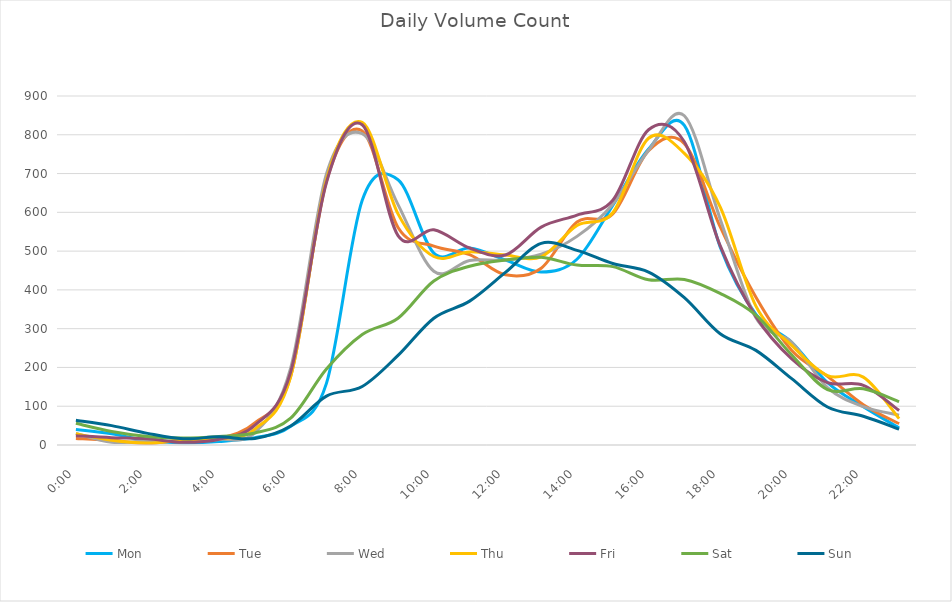
| Category | Mon | Tue | Wed | Thu | Fri | Sat | Sun |
|---|---|---|---|---|---|---|---|
| 0.0 | 40 | 17 | 30 | 29 | 24 | 56 | 64 |
| 0.0416666666666667 | 29 | 12 | 7 | 12 | 19 | 35 | 50 |
| 0.0833333333333333 | 11 | 4 | 11 | 5 | 16 | 22 | 30 |
| 0.125 | 6 | 14 | 8 | 13 | 7 | 18 | 16 |
| 0.166666666666667 | 9 | 17 | 14 | 16 | 15 | 22 | 21 |
| 0.208333333333333 | 19 | 57 | 32 | 41 | 51 | 31 | 17 |
| 0.25 | 48 | 177 | 198 | 176 | 188 | 69 | 49 |
| 0.291666666666667 | 159 | 680 | 699 | 684 | 677 | 196 | 126 |
| 0.333333333333333 | 631 | 810 | 803 | 832 | 826 | 285 | 151 |
| 0.375 | 684 | 561 | 620 | 596 | 540 | 327 | 231 |
| 0.416666666666667 | 495 | 513 | 448 | 486 | 555 | 423 | 327 |
| 0.4583333333333333 | 508 | 491 | 476 | 498 | 508 | 461 | 371 |
| 0.5 | 477 | 439 | 477 | 490 | 490 | 477 | 445 |
| 0.541666666666667 | 446 | 456 | 492 | 485 | 562 | 484 | 520 |
| 0.5833333333333334 | 479 | 575 | 538 | 566 | 593 | 464 | 502 |
| 0.625 | 618 | 596 | 621 | 599 | 631 | 460 | 468 |
| 0.666666666666667 | 763 | 759 | 760 | 791 | 813 | 426 | 446 |
| 0.7083333333333334 | 824 | 777 | 849 | 752 | 782 | 427 | 380 |
| 0.75 | 511 | 563 | 583 | 614 | 514 | 391 | 287 |
| 0.791666666666667 | 337 | 381 | 328 | 358 | 331 | 335 | 244 |
| 0.8333333333333334 | 265 | 244 | 265 | 257 | 222 | 232 | 171 |
| 0.875 | 161 | 177 | 148 | 179 | 161 | 143 | 98 |
| 0.916666666666667 | 99 | 104 | 99 | 175 | 154 | 145 | 74 |
| 0.9583333333333334 | 44 | 55 | 77 | 68 | 89 | 112 | 41 |